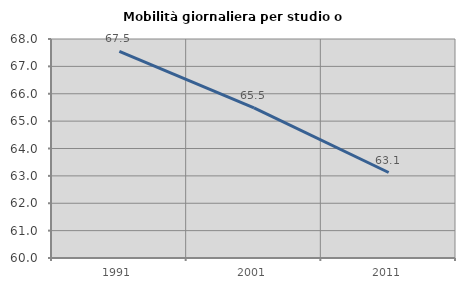
| Category | Mobilità giornaliera per studio o lavoro |
|---|---|
| 1991.0 | 67.549 |
| 2001.0 | 65.486 |
| 2011.0 | 63.123 |